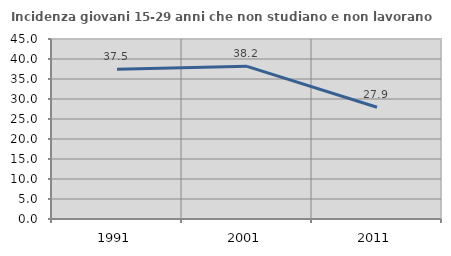
| Category | Incidenza giovani 15-29 anni che non studiano e non lavorano  |
|---|---|
| 1991.0 | 37.45 |
| 2001.0 | 38.16 |
| 2011.0 | 27.939 |